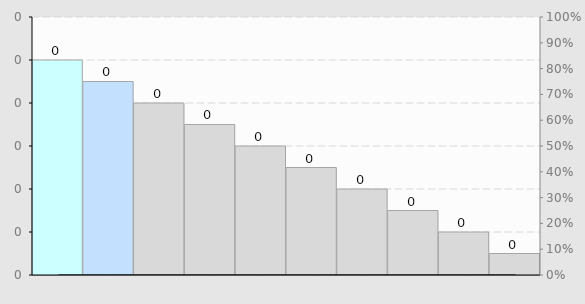
| Category | Ordered totals |
|---|---|
| 0 | 0.1 |
| 1 | 0.09 |
| 2 | 0.08 |
| 3 | 0.07 |
| 4 | 0.06 |
| 5 | 0.05 |
| 6 | 0.04 |
| 7 | 0.03 |
| 8 | 0.02 |
| 9 | 0.01 |